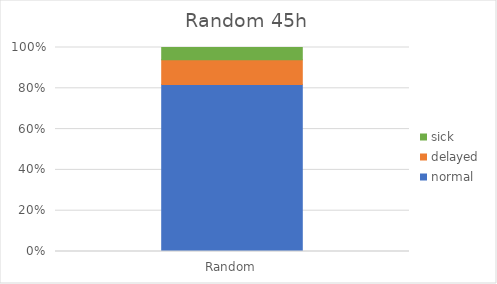
| Category | normal | delayed | sick |
|---|---|---|---|
| 0 | 27 | 4 | 2 |